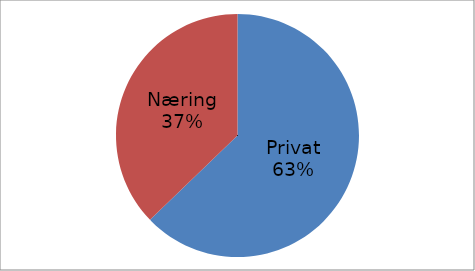
| Category | Series 0 |
|---|---|
| Privat | 45393557 |
| Næring | 26896707 |